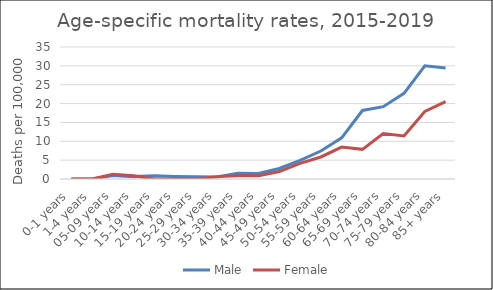
| Category | Male | Female |
|---|---|---|
| 0-1 years | 0 | 0 |
| 1-4 years | 0 | 0 |
| 05-09 years | 0.91 | 1.23 |
| 10-14 years | 0.63 | 0.84 |
| 15-19 years | 0.83 | 0 |
| 20-24 years | 0.69 | 0 |
| 25-29 years | 0.59 | 0 |
| 30-34 years | 0.52 | 0.63 |
| 35-39 years | 1.5 | 0.89 |
| 40-44 years | 1.48 | 0.88 |
| 45-49 years | 2.78 | 1.97 |
| 50-54 years | 4.95 | 4.13 |
| 55-59 years | 7.42 | 5.84 |
| 60-64 years | 10.91 | 8.47 |
| 65-69 years | 18.17 | 7.86 |
| 70-74 years | 19.18 | 12.03 |
| 75-79 years | 22.7 | 11.42 |
| 80-84 years | 30.01 | 17.91 |
| 85+ years | 29.45 | 20.54 |